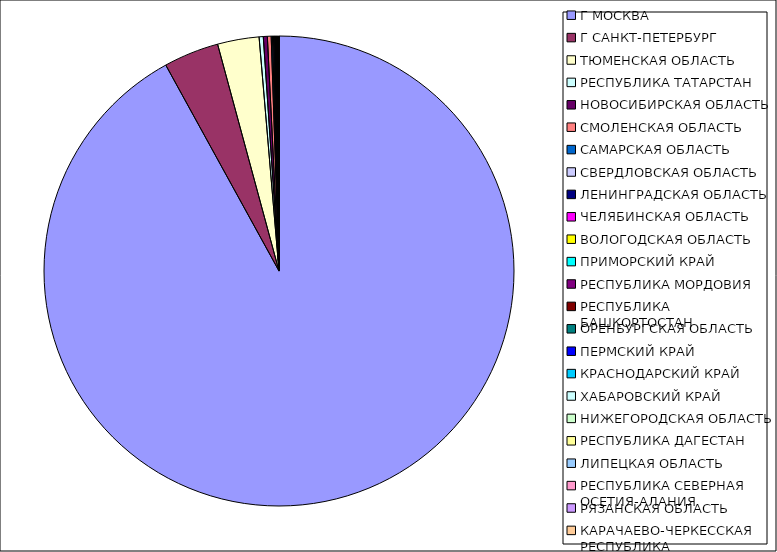
| Category | Оборот |
|---|---|
| Г МОСКВА | 0.919 |
| Г САНКТ-ПЕТЕРБУРГ | 0.038 |
| ТЮМЕНСКАЯ ОБЛАСТЬ | 0.029 |
| РЕСПУБЛИКА ТАТАРСТАН | 0.003 |
| НОВОСИБИРСКАЯ ОБЛАСТЬ | 0.003 |
| СМОЛЕНСКАЯ ОБЛАСТЬ | 0.003 |
| САМАРСКАЯ ОБЛАСТЬ | 0.001 |
| СВЕРДЛОВСКАЯ ОБЛАСТЬ | 0.001 |
| ЛЕНИНГРАДСКАЯ ОБЛАСТЬ | 0.001 |
| ЧЕЛЯБИНСКАЯ ОБЛАСТЬ | 0 |
| ВОЛОГОДСКАЯ ОБЛАСТЬ | 0 |
| ПРИМОРСКИЙ КРАЙ | 0 |
| РЕСПУБЛИКА МОРДОВИЯ | 0 |
| РЕСПУБЛИКА БАШКОРТОСТАН | 0 |
| ОРЕНБУРГСКАЯ ОБЛАСТЬ | 0 |
| ПЕРМСКИЙ КРАЙ | 0 |
| КРАСНОДАРСКИЙ КРАЙ | 0 |
| ХАБАРОВСКИЙ КРАЙ | 0 |
| НИЖЕГОРОДСКАЯ ОБЛАСТЬ | 0 |
| РЕСПУБЛИКА ДАГЕСТАН | 0 |
| ЛИПЕЦКАЯ ОБЛАСТЬ | 0 |
| РЕСПУБЛИКА СЕВЕРНАЯ ОСЕТИЯ-АЛАНИЯ | 0 |
| РЯЗАНСКАЯ ОБЛАСТЬ | 0 |
| КАРАЧАЕВО-ЧЕРКЕССКАЯ РЕСПУБЛИКА | 0 |
| ИРКУТСКАЯ ОБЛАСТЬ | 0 |
| СТАВРОПОЛЬСКИЙ КРАЙ | 0 |
| КИРОВСКАЯ ОБЛАСТЬ | 0 |
| САХАЛИНСКАЯ ОБЛАСТЬ | 0 |
| УДМУРТСКАЯ РЕСПУБЛИКА | 0 |
| РОСТОВСКАЯ ОБЛАСТЬ | 0 |